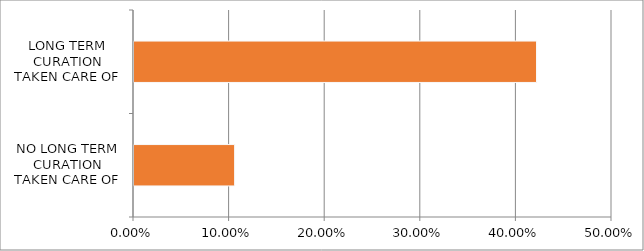
| Category | Series 0 |
|---|---|
| NO LONG TERM CURATION TAKEN CARE OF | 0.105 |
| LONG TERM CURATION TAKEN CARE OF | 0.421 |